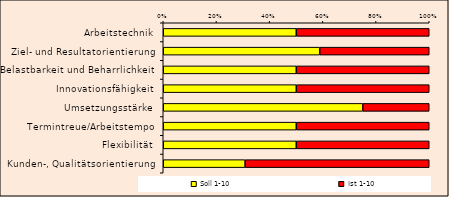
| Category | Soll 1-10 | Ist 1-10 |
|---|---|---|
| Arbeitstechnik | 10 | 10 |
| Ziel- und Resultatorientierung | 10 | 7 |
| Belastbarkeit und Beharrlichkeit | 5 | 5 |
| Innovationsfähigkeit | 5 | 5 |
| Umsetzungsstärke | 9 | 3 |
| Termintreue/Arbeitstempo | 8 | 8 |
| Flexibilität | 3 | 3 |
| Kunden-, Qualitätsorientierung | 4 | 9 |